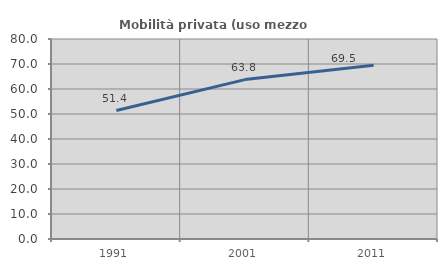
| Category | Mobilità privata (uso mezzo privato) |
|---|---|
| 1991.0 | 51.389 |
| 2001.0 | 63.76 |
| 2011.0 | 69.465 |